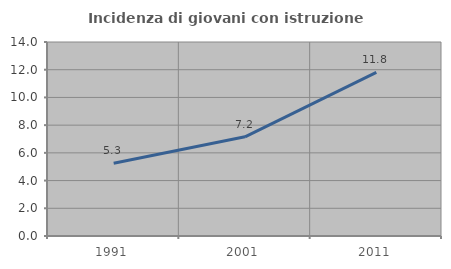
| Category | Incidenza di giovani con istruzione universitaria |
|---|---|
| 1991.0 | 5.251 |
| 2001.0 | 7.157 |
| 2011.0 | 11.814 |